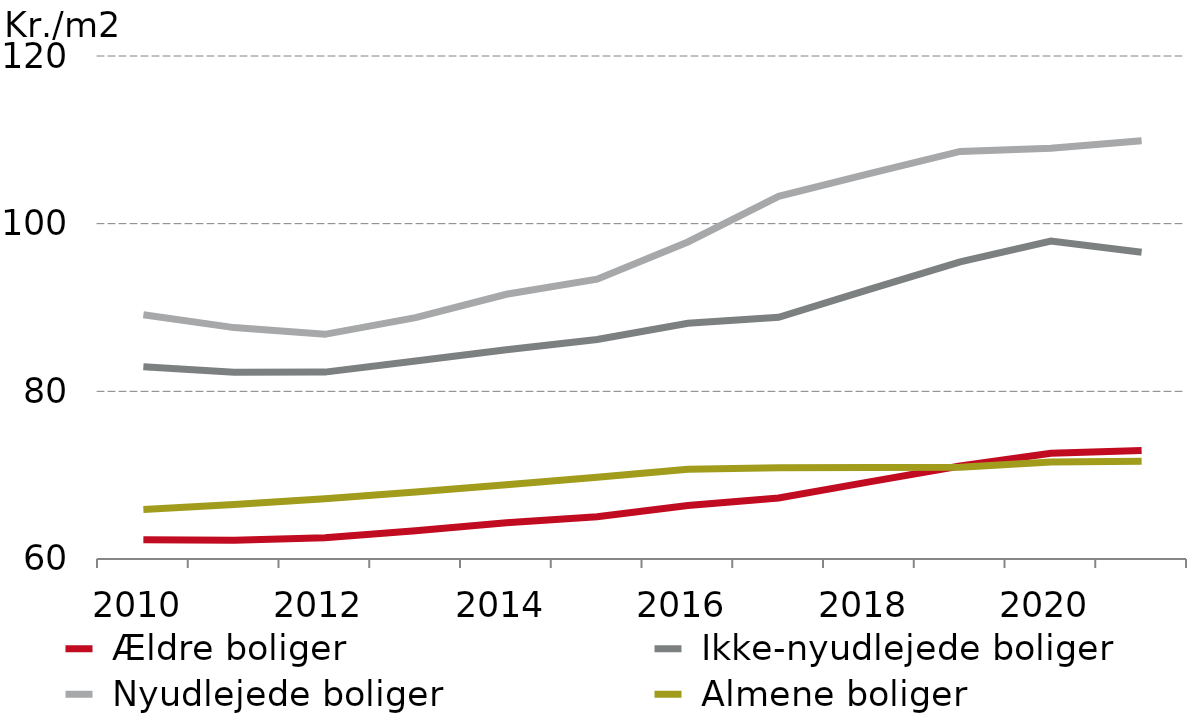
| Category |  Ældre boliger |  Ikke-nyudlejede boliger |  Nyudlejede boliger |  Almene boliger |
|---|---|---|---|---|
| 0 | 62.291 | 82.929 | 89.131 | 65.909 |
| 1 | 62.242 | 82.275 | 87.601 | 66.514 |
| 2 | 62.526 | 82.293 | 86.801 | 67.193 |
| 3 | 63.356 | 83.623 | 88.789 | 67.986 |
| 4 | 64.318 | 84.95 | 91.578 | 68.866 |
| 5 | 65.05 | 86.181 | 93.384 | 69.748 |
| 6 | 66.384 | 88.124 | 97.819 | 70.693 |
| 7 | 67.268 | 88.833 | 103.258 | 70.894 |
| 8 | 69.2 | 92.169 | 105.96 | 70.922 |
| 9 | 71.098 | 95.446 | 108.615 | 70.95 |
| 10 | 72.62 | 97.917 | 109.004 | 71.581 |
| 11 | 72.939 | 96.598 | 109.896 | 71.656 |